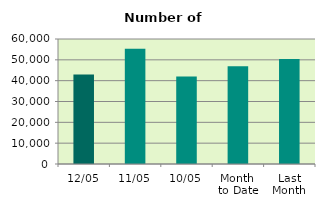
| Category | Series 0 |
|---|---|
| 12/05 | 42940 |
| 11/05 | 55358 |
| 10/05 | 41962 |
| Month 
to Date | 46967.111 |
| Last
Month | 50445.556 |